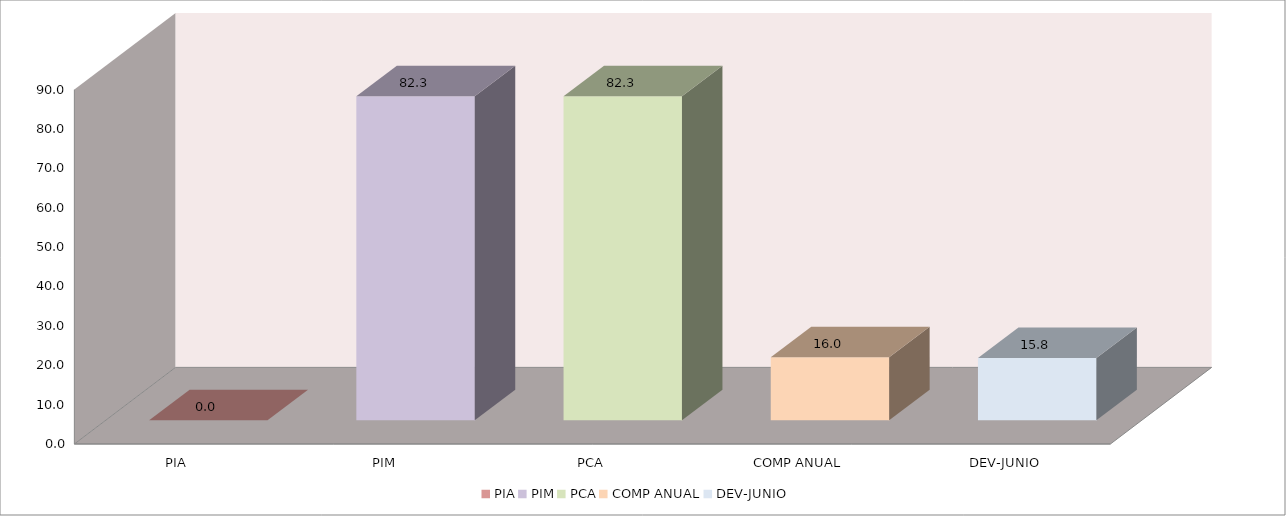
| Category | 011 MINISTERIO DE SALUD |
|---|---|
| PIA | 0 |
| PIM | 82.281 |
| PCA | 82.281 |
| COMP ANUAL | 16 |
| DEV-JUNIO | 15.814 |